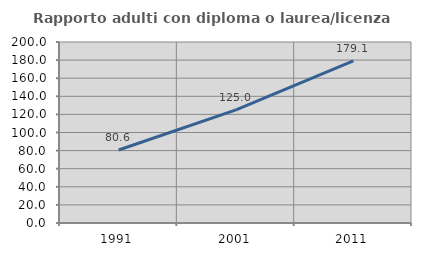
| Category | Rapporto adulti con diploma o laurea/licenza media  |
|---|---|
| 1991.0 | 80.614 |
| 2001.0 | 124.957 |
| 2011.0 | 179.124 |